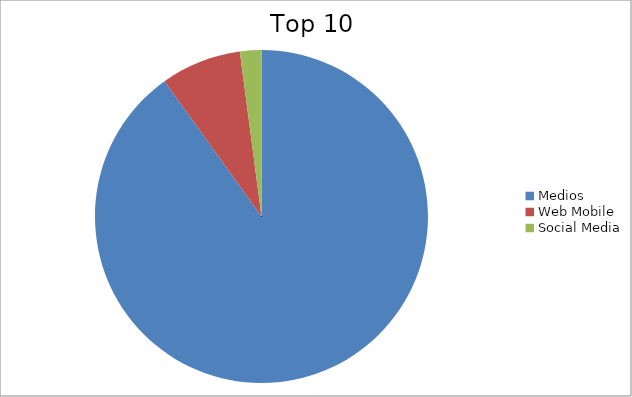
| Category | Series 0 |
|---|---|
| Medios | 90.1 |
| Web Mobile | 7.81 |
| Social Media | 2.08 |